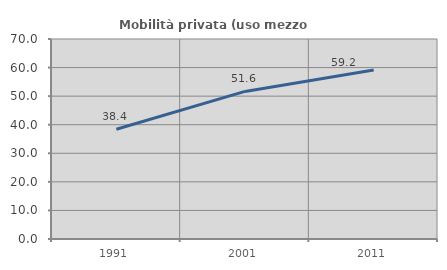
| Category | Mobilità privata (uso mezzo privato) |
|---|---|
| 1991.0 | 38.433 |
| 2001.0 | 51.648 |
| 2011.0 | 59.154 |